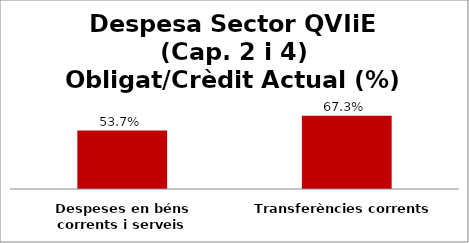
| Category | Series 0 |
|---|---|
| Despeses en béns corrents i serveis | 0.537 |
| Transferències corrents | 0.673 |